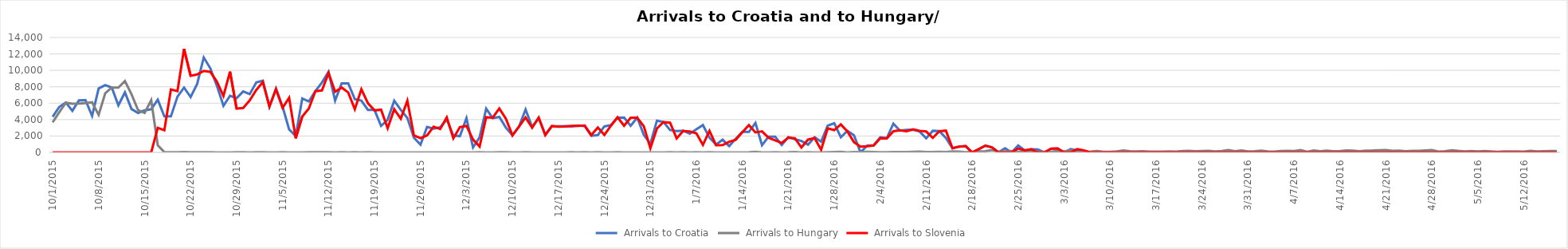
| Category | Arrivals to Croatia | Arrivals to Hungary | Arrivals to Slovenia |
|---|---|---|---|
| 10/1/15 | 4344 | 3667 | 0 |
| 10/2/15 | 5546 | 4897 | 0 |
| 10/3/15 | 6086 | 6056 | 0 |
| 10/4/15 | 5065 | 5925 | 0 |
| 10/5/15 | 6338 | 5952 | 0 |
| 10/6/15 | 6370 | 6000 | 0 |
| 10/7/15 | 4446 | 6103 | 0 |
| 10/8/15 | 7798 | 4583 | 6 |
| 10/9/15 | 8201 | 7215 | 0 |
| 10/10/15 | 7896 | 7907 | 0 |
| 10/11/15 | 5732 | 7897 | 0 |
| 10/12/15 | 7317 | 8702 | 0 |
| 10/13/15 | 5286 | 7081 | 0 |
| 10/14/15 | 4814 | 5157 | 0 |
| 10/15/15 | 5138 | 4808 | 0 |
| 10/16/15 | 5260 | 6353 | 0 |
| 10/17/15 | 6415 | 870 | 3000 |
| 10/18/15 | 4390 | 41 | 2700 |
| 10/19/15 | 4388 | 22 | 7677 |
| 10/20/15 | 6793 | 36 | 7478 |
| 10/21/15 | 7900 | 39 | 12616 |
| 10/22/15 | 6748 | 32 | 9339 |
| 10/23/15 | 8348 | 29 | 9500 |
| 10/24/15 | 11570 | 35 | 9925 |
| 10/25/15 | 10249 | 34 | 9818 |
| 10/26/15 | 8128 | 12 | 8625 |
| 10/27/15 | 5683 | 7 | 6877 |
| 10/28/15 | 6900 | 4 | 9848 |
| 10/29/15 | 6615 | 23 | 5341 |
| 10/30/15 | 7429 | 18 | 5409 |
| 10/31/15 | 7110 | 10 | 6344 |
| 11/1/15 | 8534 | 14 | 7611 |
| 11/2/15 | 8746 | 31 | 8568 |
| 11/3/15 | 5573 | 8 | 5591 |
| 11/4/15 | 7792 | 10 | 7693 |
| 11/5/15 | 5587 | 18 | 5426 |
| 11/6/15 | 2809 | 4 | 6655 |
| 11/7/15 | 2000 | 8 | 1716 |
| 11/8/15 | 6579 | 9 | 4381 |
| 11/9/15 | 6214 | 25 | 5341 |
| 11/10/15 | 7474 | 14 | 7457 |
| 11/11/15 | 8524 | 13 | 7554 |
| 11/12/15 | 9823 | 23 | 9681 |
| 11/13/15 | 6314 | 6 | 7397 |
| 11/14/15 | 8405 | 21 | 7905 |
| 11/15/15 | 8415 | 8 | 7300 |
| 11/16/15 | 6490 | 15 | 5261 |
| 11/17/15 | 6304 | 5 | 7704 |
| 11/18/15 | 5180 | 15 | 5998 |
| 11/19/15 | 5167 | 4 | 5119 |
| 11/20/15 | 3230 | 9 | 5211 |
| 11/21/15 | 3977 | 2 | 2952 |
| 11/22/15 | 6305 | 11 | 5260 |
| 11/23/15 | 5184 | 4 | 4102 |
| 11/24/15 | 4203 | 4 | 6297 |
| 11/25/15 | 1808 | 6 | 2070 |
| 11/26/15 | 952 | 10 | 1742 |
| 11/27/15 | 3095 | 2 | 2065 |
| 11/28/15 | 2886 | 6 | 3139 |
| 11/29/15 | 3060 | 3 | 2843 |
| 11/30/15 | 4009 | 7 | 4274 |
| 12/1/15 | 2066 | 4 | 1709 |
| 12/2/15 | 1982 | 4 | 3077 |
| 12/3/15 | 4174 | 9 | 3237 |
| 12/4/15 | 611 | 1 | 1577 |
| 12/5/15 | 1835 | 31 | 715 |
| 12/6/15 | 5339 | 7 | 4288 |
| 12/7/15 | 4162 | 0 | 4240 |
| 12/8/15 | 4335 | 13 | 5351 |
| 12/9/15 | 3027 | 14 | 4103 |
| 12/10/15 | 2076 | 3 | 2078 |
| 12/11/15 | 3149 | 0 | 3149 |
| 12/12/15 | 5225 | 13 | 4271 |
| 12/13/15 | 3112 | 10 | 3016 |
| 12/14/15 | 4174 | 3 | 4250 |
| 12/15/15 | 2160 | 2 | 2098 |
| 12/16/15 | 3177 | 6 | 3214 |
| 12/17/15 | 3192 | 0 | 3135 |
| 12/18/15 | 3200 | 11 | 3150 |
| 12/19/15 | 3156 | 31 | 3222 |
| 12/20/15 | 3276 | 8 | 3233 |
| 12/21/15 | 3210 | 25 | 3278 |
| 12/22/15 | 2027 | 1 | 2118 |
| 12/23/15 | 2116 | 21 | 3030 |
| 12/24/15 | 3166 | 8 | 2131 |
| 12/25/15 | 3339 | 2 | 3257 |
| 12/26/15 | 4241 | 17 | 4274 |
| 12/27/15 | 4251 | 10 | 3253 |
| 12/28/15 | 3249 | 0 | 4228 |
| 12/29/15 | 4253 | 0 | 4239 |
| 12/30/15 | 2132 | 11 | 3195 |
| 12/31/15 | 1058 | 5 | 511 |
| 1/1/16 | 3869 | 0 | 2914 |
| 1/2/16 | 3710 | 0 | 3690 |
| 1/3/16 | 2732 | 17 | 3619 |
| 1/4/16 | 2591 | 3 | 1708 |
| 1/5/16 | 2650 | 18 | 2626 |
| 1/6/16 | 2273 | 5 | 2550 |
| 1/7/16 | 2814 | 31 | 2337 |
| 1/8/16 | 3332 | 7 | 916 |
| 1/9/16 | 1799 | 15 | 2630 |
| 1/10/16 | 942 | 6 | 880 |
| 1/11/16 | 1549 | 7 | 897 |
| 1/12/16 | 769 | 2 | 1308 |
| 1/13/16 | 1679 | 5 | 1544 |
| 1/14/16 | 2502 | 4 | 2449 |
| 1/15/16 | 2493 | 14 | 3330 |
| 1/16/16 | 3579 | 65 | 2435 |
| 1/17/16 | 878 | 11 | 2570 |
| 1/18/16 | 1930 | 9 | 1783 |
| 1/19/16 | 1917 | 29 | 1476 |
| 1/20/16 | 914 | 10 | 1154 |
| 1/21/16 | 1865 | 13 | 1787 |
| 1/22/16 | 1599 | 47 | 1738 |
| 1/23/16 | 1394 | 10 | 606 |
| 1/24/16 | 946 | 15 | 1564 |
| 1/25/16 | 1847 | 5 | 1746 |
| 1/26/16 | 1309 | 4 | 326 |
| 1/27/16 | 3256 | 36 | 2935 |
| 1/28/16 | 3565 | 51 | 2719 |
| 1/29/16 | 1843 | 69 | 3416 |
| 1/30/16 | 2641 | 6 | 2556 |
| 1/31/16 | 2098 | 39 | 1249 |
| 2/1/16 | 0 | 31 | 716 |
| 2/2/16 | 822 | 69 | 765 |
| 2/3/16 | 881 | 46 | 841 |
| 2/4/16 | 1836 | 31 | 1733 |
| 2/5/16 | 1750 | 19 | 1713 |
| 2/6/16 | 3510 | 49 | 2580 |
| 2/7/16 | 2658 | 53 | 2694 |
| 2/8/16 | 2736 | 48 | 2582 |
| 2/9/16 | 2764 | 72 | 2805 |
| 2/10/16 | 2544 | 104 | 2637 |
| 2/11/16 | 1716 | 54 | 2547 |
| 2/12/16 | 2635 | 39 | 1774 |
| 2/13/16 | 2595 | 66 | 2576 |
| 2/14/16 | 1749 | 51 | 2660 |
| 2/15/16 | 512 | 119 | 516 |
| 2/16/16 | 701 | 93 | 715 |
| 2/17/16 | 769 | 34 | 769 |
| 2/18/16 | 0 | 73 | 0 |
| 2/19/16 | 408 | 113 | 407 |
| 2/20/16 | 834 | 151 | 828 |
| 2/21/16 | 630 | 288 | 623 |
| 2/22/16 | 0 | 103 | 0 |
| 2/23/16 | 507 | 112 | 0 |
| 2/24/16 | 0 | 166 | 0 |
| 2/25/16 | 841 | 76 | 478 |
| 2/26/16 | 250 | 140 | 254 |
| 2/27/16 | 385 | 111 | 382 |
| 2/28/16 | 358 | 62 | 0 |
| 2/29/16 | 0 | 78 | 0 |
| 3/1/16 | 436 | 83 | 466 |
| 3/2/16 | 476 | 181 | 479 |
| 3/3/16 | 0 | 133 | 0 |
| 3/4/16 | 410 | 268 | 0 |
| 3/5/16 | 253 | 89 | 409 |
| 3/6/16 | 0 | 72 | 253 |
| 3/7/16 | 0 | 100 | 0 |
| 3/8/16 | 0 | 167 | 0 |
| 3/9/16 | 0 | 73 | 0 |
| 3/10/16 | 0 | 70 | 0 |
| 3/11/16 | 0 | 133 | 0 |
| 3/12/16 | 0 | 245 | 0 |
| 3/13/16 | 0 | 148 | 0 |
| 3/14/16 | 0 | 123 | 0 |
| 3/15/16 | 0 | 153 | 0 |
| 3/16/16 | 0 | 104 | 0 |
| 3/17/16 | 0 | 102 | 0 |
| 3/18/16 | 0 | 95 | 0 |
| 3/19/16 | 0 | 132 | 0 |
| 3/20/16 | 0 | 107 | 0 |
| 3/21/16 | 0 | 176 | 0 |
| 3/22/16 | 0 | 188 | 0 |
| 3/23/16 | 0 | 137 | 0 |
| 3/24/16 | 0 | 171 | 0 |
| 3/25/16 | 0 | 199 | 0 |
| 3/26/16 | 0 | 125 | 0 |
| 3/27/16 | 0 | 171 | 6 |
| 3/28/16 | 0 | 293 | 0 |
| 3/29/16 | 0 | 154 | 5 |
| 3/30/16 | 0 | 234 | 4 |
| 3/31/16 | 0 | 127 | 0 |
| 4/1/16 | 0 | 142 | 0 |
| 4/2/16 | 0 | 217 | 0 |
| 4/3/16 | 0 | 119 | 0 |
| 4/4/16 | 0 | 99 | 0 |
| 4/5/16 | 0 | 176 | 2 |
| 4/6/16 | 0 | 191 | 0 |
| 4/7/16 | 0 | 178 | 0 |
| 4/8/16 | 0 | 280 | 0 |
| 4/9/16 | 0 | 83 | 0 |
| 4/10/16 | 0 | 230 | 0 |
| 4/11/16 | 0 | 149 | 0 |
| 4/12/16 | 0 | 214 | 0 |
| 4/13/16 | 0 | 150 | 0 |
| 4/14/16 | 0 | 161 | 0 |
| 4/15/16 | 0 | 237 | 0 |
| 4/16/16 | 0 | 210 | 0 |
| 4/17/16 | 0 | 144 | 0 |
| 4/18/16 | 0 | 229 | 0 |
| 4/19/16 | 0 | 235 | 0 |
| 4/20/16 | 0 | 274 | 0 |
| 4/21/16 | 0 | 294 | 0 |
| 4/22/16 | 0 | 195 | 0 |
| 4/23/16 | 0 | 226 | 0 |
| 4/24/16 | 0 | 151 | 0 |
| 4/25/16 | 0 | 202 | 0 |
| 4/26/16 | 0 | 190 | 0 |
| 4/27/16 | 0 | 241 | 0 |
| 4/28/16 | 0 | 284 | 0 |
| 4/29/16 | 0 | 108 | 0 |
| 4/30/16 | 0 | 141 | 0 |
| 5/1/16 | 0 | 274 | 0 |
| 5/2/16 | 0 | 187 | 0 |
| 5/3/16 | 0 | 131 | 0 |
| 5/4/16 | 0 | 169 | 0 |
| 5/5/16 | 0 | 133 | 0 |
| 5/6/16 | 0 | 178 | 0 |
| 5/7/16 | 0 | 132 | 0 |
| 5/8/16 | 0 | 75 | 0 |
| 5/9/16 | 0 | 124 | 0 |
| 5/10/16 | 0 | 128 | 0 |
| 5/11/16 | 0 | 120 | 0 |
| 5/12/16 | 0 | 89 | 0 |
| 5/13/16 | 0 | 201 | 0 |
| 5/14/16 | 0 | 120 | 0 |
| 5/15/16 | 0 | 139 | 0 |
| 5/16/16 | 0 | 169 | 0 |
| 5/17/16 | 0 | 164 | 0 |